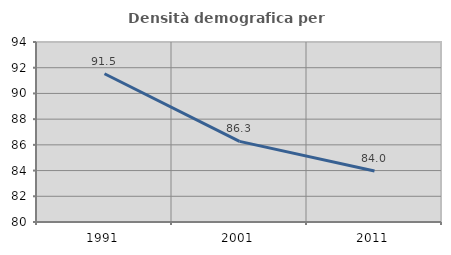
| Category | Densità demografica |
|---|---|
| 1991.0 | 91.531 |
| 2001.0 | 86.273 |
| 2011.0 | 83.963 |